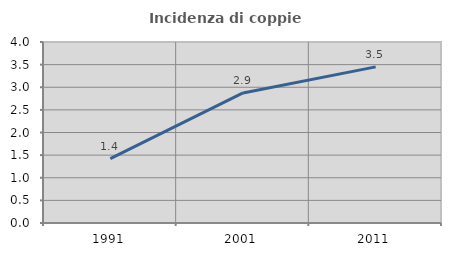
| Category | Incidenza di coppie miste |
|---|---|
| 1991.0 | 1.424 |
| 2001.0 | 2.874 |
| 2011.0 | 3.45 |